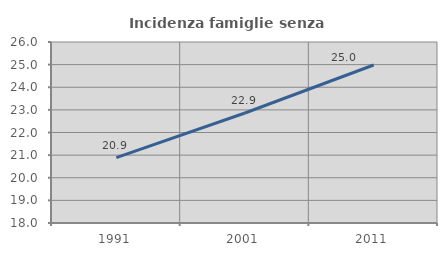
| Category | Incidenza famiglie senza nuclei |
|---|---|
| 1991.0 | 20.887 |
| 2001.0 | 22.862 |
| 2011.0 | 24.984 |